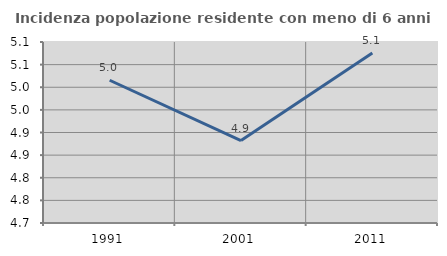
| Category | Incidenza popolazione residente con meno di 6 anni |
|---|---|
| 1991.0 | 5.015 |
| 2001.0 | 4.882 |
| 2011.0 | 5.076 |